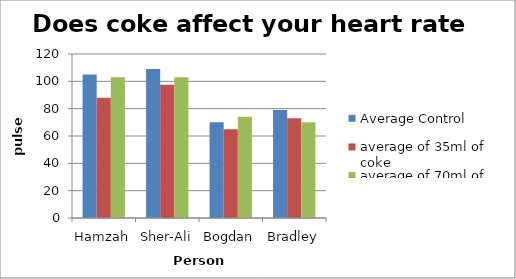
| Category | Average Control | average of 35ml of coke  | average of 70ml of coke  |
|---|---|---|---|
| Hamzah | 105 | 88 | 103 |
| Sher-Ali | 109 | 97.5 | 103 |
| Bogdan | 70 | 65 | 74 |
| Bradley | 79 | 73 | 70 |